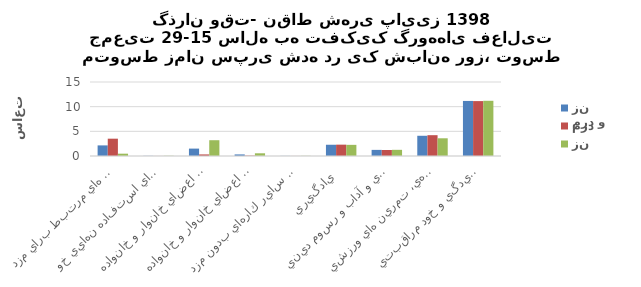
| Category | مرد و زن | مرد | زن |
|---|---|---|---|
| اشتغال و فعاليت هاي مرتبط براي مزد  | 2.15 | 3.51 | 0.47 |
| توليد كالا براي استفاده نهايي خود   | 0.03 | 0.01 | 0.04 |
| خدمات خانگي بدون مزد براي اعضاي خانوار و خانواده   | 1.5 | 0.32 | 3.2 |
| خدمات مراقبتي بدون مزد براي اعضاي خانوار و خانواده   | 0.32 | 0.08 | 0.55 |
| كارداوطلبانه بدون مزد، كار آموزي و ساير كارهاي بدون مزد  | 0.02 | 0.01 | 0.03 |
| يادگيري  | 2.28 | 2.3 | 2.26 |
| معاشرت، ارتباط، مشاركت اجتماعي و آداب و رسوم ديني  | 1.24 | 1.22 | 1.25 |
| فرهنگ، فراغت، رسانه هاي گروهي، تمرين هاي ورزشي  | 4.1 | 4.22 | 3.59 |
| رسيدگي و خود مراقبتي   | 11.16 | 11.13 | 11.19 |